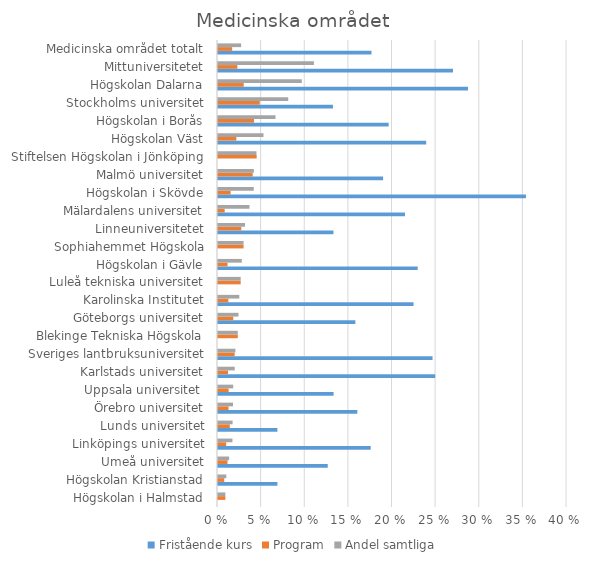
| Category | Fristående kurs | Program | Andel samtliga |
|---|---|---|---|
| Högskolan i Halmstad | 0 | 0.008 | 0.008 |
| Högskolan Kristianstad | 0.068 | 0.007 | 0.01 |
| Umeå universitet | 0.126 | 0.011 | 0.013 |
| Linköpings universitet | 0.175 | 0.009 | 0.017 |
| Lunds universitet | 0.068 | 0.014 | 0.017 |
| Örebro universitet | 0.16 | 0.012 | 0.017 |
| Uppsala universitet  | 0.132 | 0.012 | 0.017 |
| Karlstads universitet | 0.249 | 0.011 | 0.019 |
| Sveriges lantbruksuniversitet | 0.246 | 0.019 | 0.02 |
| Blekinge Tekniska Högskola | 0 | 0.023 | 0.023 |
| Göteborgs universitet | 0.157 | 0.017 | 0.023 |
| Karolinska Institutet | 0.224 | 0.012 | 0.024 |
| Luleå tekniska universitet | 0 | 0.026 | 0.026 |
| Högskolan i Gävle | 0.229 | 0.011 | 0.027 |
| Sophiahemmet Högskola | 0 | 0.029 | 0.029 |
| Linneuniversitetet | 0.132 | 0.027 | 0.031 |
| Mälardalens universitet | 0.214 | 0.008 | 0.036 |
| Högskolan i Skövde | 0.353 | 0.014 | 0.041 |
| Malmö universitet | 0.189 | 0.04 | 0.041 |
| Stiftelsen Högskolan i Jönköping | 0 | 0.044 | 0.044 |
| Högskolan Väst | 0.239 | 0.021 | 0.052 |
| Högskolan i Borås | 0.196 | 0.041 | 0.066 |
| Stockholms universitet | 0.132 | 0.048 | 0.08 |
| Högskolan Dalarna | 0.287 | 0.029 | 0.096 |
| Mittuniversitetet | 0.269 | 0.022 | 0.11 |
| Medicinska området totalt | 0.176 | 0.016 | 0.026 |